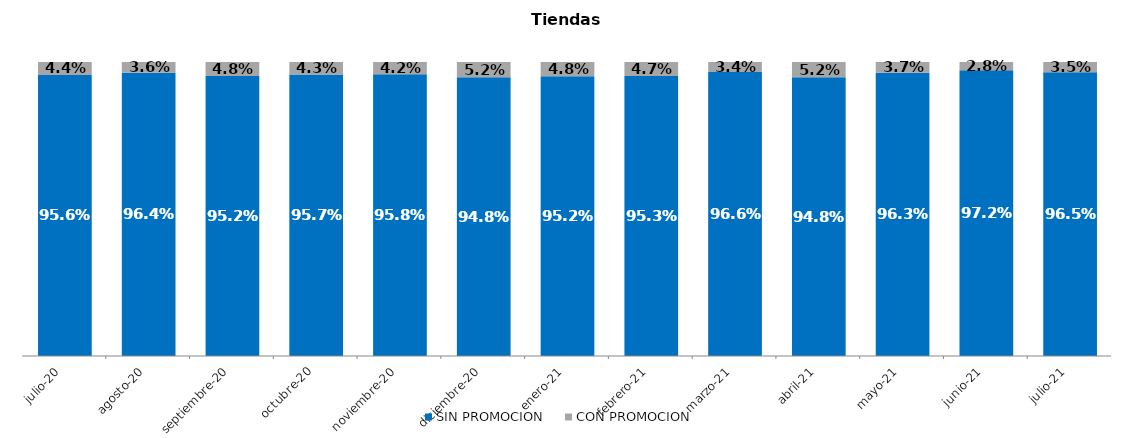
| Category | SIN PROMOCION   | CON PROMOCION   |
|---|---|---|
| 2020-07-01 | 0.956 | 0.044 |
| 2020-08-01 | 0.964 | 0.036 |
| 2020-09-01 | 0.952 | 0.048 |
| 2020-10-01 | 0.957 | 0.043 |
| 2020-11-01 | 0.958 | 0.042 |
| 2020-12-01 | 0.948 | 0.052 |
| 2021-01-01 | 0.952 | 0.048 |
| 2021-02-01 | 0.953 | 0.047 |
| 2021-03-01 | 0.966 | 0.034 |
| 2021-04-01 | 0.948 | 0.052 |
| 2021-05-01 | 0.963 | 0.037 |
| 2021-06-01 | 0.972 | 0.028 |
| 2021-07-01 | 0.965 | 0.035 |